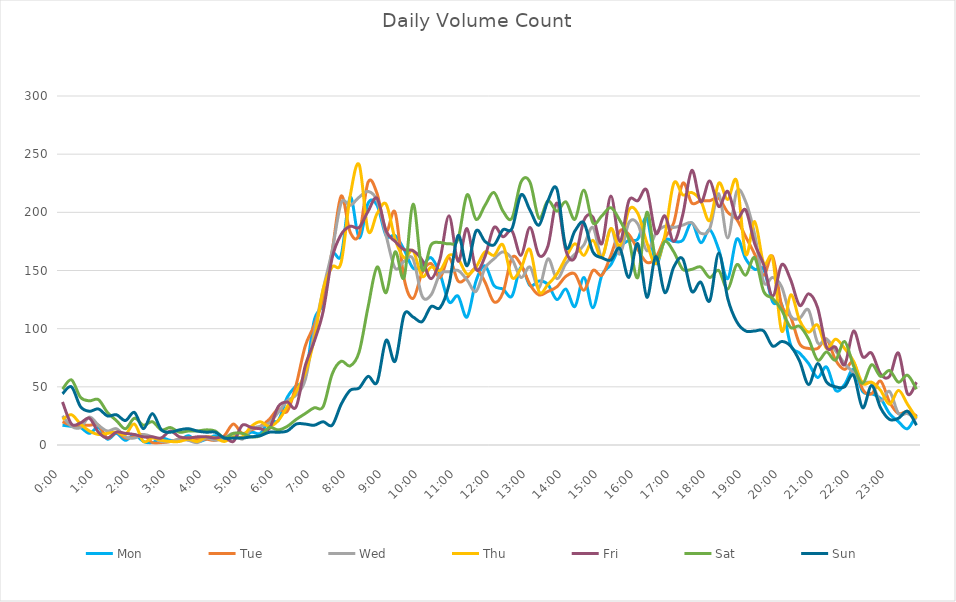
| Category | Mon | Tue | Wed | Thu | Fri | Sat | Sun |
|---|---|---|---|---|---|---|---|
| 0.0 | 17 | 20 | 25 | 22 | 37 | 48 | 44 |
| 0.010416666666666666 | 16 | 17 | 16 | 26 | 18 | 56 | 50 |
| 0.020833333333333332 | 15 | 17 | 15 | 18 | 19 | 41 | 33 |
| 0.03125 | 10 | 17 | 24 | 12 | 23 | 38 | 29 |
| 0.041666666666666664 | 15 | 17 | 17 | 9 | 11 | 39 | 31 |
| 0.05208333333333333 | 5 | 6 | 12 | 10 | 6 | 28 | 25 |
| 0.06249999999999999 | 10 | 11 | 14 | 11 | 11 | 21 | 26 |
| 0.07291666666666666 | 4 | 6 | 7 | 9 | 10 | 14 | 21 |
| 0.08333333333333333 | 9 | 7 | 6 | 18 | 9 | 23 | 28 |
| 0.09375 | 3 | 9 | 9 | 3 | 7 | 17 | 14 |
| 0.10416666666666667 | 2 | 2 | 7 | 6 | 7 | 20 | 27 |
| 0.11458333333333334 | 6 | 2 | 3 | 4 | 6 | 13 | 13 |
| 0.125 | 4 | 3 | 3 | 3 | 12 | 15 | 11 |
| 0.13541666666666666 | 4 | 5 | 5 | 3 | 7 | 11 | 13 |
| 0.14583333333333331 | 8 | 6 | 4 | 5 | 6 | 12 | 14 |
| 0.15624999999999997 | 3 | 5 | 2 | 3 | 7 | 12 | 12 |
| 0.16666666666666663 | 5 | 5 | 6 | 7 | 7 | 13 | 11 |
| 0.1770833333333333 | 8 | 4 | 4 | 6 | 6 | 12 | 11 |
| 0.18749999999999994 | 5 | 8 | 6 | 3 | 7 | 6 | 6 |
| 0.1979166666666666 | 7 | 18 | 10 | 7 | 3 | 10 | 6 |
| 0.20833333333333326 | 6 | 10 | 5 | 7 | 17 | 10 | 6 |
| 0.21874999999999992 | 11 | 13 | 14 | 16 | 15 | 7 | 7 |
| 0.22916666666666657 | 10 | 16 | 16 | 20 | 14 | 8 | 8 |
| 0.23958333333333323 | 21 | 22 | 19 | 16 | 14 | 15 | 11 |
| 0.2499999999999999 | 21 | 31 | 28 | 21 | 33 | 13 | 11 |
| 0.2604166666666666 | 41 | 29 | 38 | 33 | 37 | 16 | 12 |
| 0.27083333333333326 | 51 | 52 | 43 | 46 | 33 | 22 | 18 |
| 0.28124999999999994 | 58 | 85 | 56 | 62 | 68 | 27 | 18 |
| 0.29166666666666663 | 107 | 103 | 97 | 91 | 89 | 32 | 17 |
| 0.3020833333333333 | 122 | 127 | 134 | 134 | 115 | 33 | 20 |
| 0.3125 | 163 | 167 | 167 | 153 | 161 | 61 | 17 |
| 0.3229166666666667 | 163 | 214 | 208 | 157 | 181 | 72 | 35 |
| 0.33333333333333337 | 213 | 183 | 206 | 214 | 188 | 68 | 47 |
| 0.34375000000000006 | 178 | 181 | 213 | 241 | 187 | 80 | 49 |
| 0.35416666666666674 | 208 | 226 | 218 | 184 | 201 | 119 | 59 |
| 0.3645833333333334 | 206 | 216 | 210 | 199 | 212 | 153 | 54 |
| 0.3750000000000001 | 180 | 184 | 180 | 207 | 184 | 131 | 90 |
| 0.3854166666666668 | 180 | 200 | 152 | 177 | 175 | 166 | 72 |
| 0.3958333333333335 | 168 | 143 | 158 | 161 | 168 | 144 | 112 |
| 0.40625000000000017 | 152 | 126 | 160 | 167 | 167 | 207 | 110 |
| 0.41666666666666685 | 154 | 148 | 128 | 145 | 159 | 151 | 106 |
| 0.4270833333333333 | 161 | 156 | 129 | 153 | 143 | 172 | 119 |
| 0.4375000000000002 | 147 | 144 | 147 | 150 | 160 | 174 | 118 |
| 0.4479166666666669 | 123 | 161 | 149 | 163 | 197 | 173 | 138 |
| 0.4583333333333333 | 128 | 141 | 150 | 160 | 158 | 177 | 180 |
| 0.4687500000000003 | 110 | 144 | 142 | 147 | 186 | 215 | 154 |
| 0.47916666666666696 | 141 | 152 | 132 | 153 | 151 | 194 | 184 |
| 0.4895833333333333 | 154 | 140 | 152 | 166 | 162 | 206 | 175 |
| 0.5000000000000003 | 137 | 123 | 160 | 163 | 187 | 217 | 172 |
| 0.510416666666667 | 134 | 131 | 166 | 172 | 179 | 201 | 185 |
| 0.5208333333333334 | 128 | 161 | 160 | 144 | 184 | 195 | 186 |
| 0.5312500000000002 | 153 | 155 | 144 | 152 | 163 | 226 | 215 |
| 0.5416666666666669 | 137 | 138 | 153 | 168 | 187 | 226 | 202 |
| 0.5520833333333335 | 141 | 129 | 135 | 132 | 163 | 195 | 189 |
| 0.5625000000000001 | 138 | 132 | 160 | 138 | 171 | 210 | 210 |
| 0.5729166666666667 | 125 | 136 | 143 | 147 | 208 | 201 | 220 |
| 0.5833333333333334 | 134 | 145 | 156 | 161 | 167 | 209 | 170 |
| 0.59375 | 119 | 147 | 164 | 173 | 161 | 194 | 184 |
| 0.6041666666666666 | 144 | 133 | 172 | 163 | 193 | 219 | 191 |
| 0.6145833333333333 | 118 | 150 | 187 | 176 | 196 | 191 | 166 |
| 0.6249999999999999 | 146 | 146 | 162 | 161 | 173 | 197 | 161 |
| 0.6354166666666665 | 155 | 163 | 186 | 186 | 214 | 204 | 159 |
| 0.6458333333333331 | 170 | 184 | 164 | 171 | 175 | 193 | 169 |
| 0.6562499999999998 | 176 | 181 | 191 | 202 | 210 | 177 | 144 |
| 0.6666666666666666 | 177 | 168 | 190 | 199 | 210 | 144 | 173 |
| 0.677083333333333 | 195 | 157 | 167 | 174 | 219 | 200 | 127 |
| 0.6874999999999997 | 156 | 161 | 182 | 156 | 182 | 160 | 162 |
| 0.6979166666666666 | 176 | 178 | 188 | 180 | 197 | 175 | 131 |
| 0.7083333333333329 | 175 | 191 | 187 | 225 | 175 | 166 | 153 |
| 0.7187499999999996 | 176 | 225 | 189 | 215 | 198 | 151 | 160 |
| 0.7291666666666666 | 191 | 208 | 191 | 217 | 236 | 151 | 132 |
| 0.7395833333333328 | 174 | 210 | 182 | 210 | 209 | 153 | 140 |
| 0.75 | 185 | 210 | 186 | 193 | 227 | 144 | 124 |
| 0.7604166666666666 | 168 | 212 | 216 | 225 | 205 | 150 | 165 |
| 0.7708333333333327 | 143 | 200 | 178 | 211 | 218 | 134 | 126 |
| 0.78125 | 177 | 194 | 218 | 227 | 195 | 155 | 106 |
| 0.7916666666666666 | 160 | 179 | 209 | 164 | 202 | 146 | 98 |
| 0.8020833333333326 | 151 | 164 | 181 | 192 | 173 | 161 | 98 |
| 0.8125 | 151 | 146 | 140 | 156 | 155 | 132 | 98 |
| 0.8229166666666666 | 123 | 162 | 144 | 160 | 128 | 126 | 85 |
| 0.8333333333333334 | 121 | 120 | 136 | 98 | 155 | 116 | 89 |
| 0.84375 | 86 | 110 | 111 | 129 | 142 | 101 | 85 |
| 0.8541666666666666 | 79 | 87 | 109 | 107 | 120 | 102 | 72 |
| 0.8645833333333334 | 70 | 83 | 116 | 97 | 130 | 91 | 52 |
| 0.875 | 58 | 83 | 88 | 103 | 118 | 73 | 70 |
| 0.8854166666666666 | 67 | 91 | 91 | 83 | 84 | 80 | 54 |
| 0.8958333333333334 | 47 | 73 | 81 | 91 | 84 | 73 | 50 |
| 0.90625 | 52 | 65 | 70 | 83 | 69 | 89 | 50 |
| 0.9166666666666666 | 65 | 71 | 62 | 72 | 98 | 68 | 60 |
| 0.9270833333333334 | 46 | 48 | 54 | 53 | 76 | 53 | 32 |
| 0.9375 | 44 | 44 | 53 | 54 | 79 | 69 | 51 |
| 0.9479166666666666 | 40 | 55 | 38 | 47 | 61 | 59 | 32 |
| 0.9583333333333334 | 27 | 37 | 46 | 35 | 59 | 64 | 22 |
| 0.96875 | 20 | 27 | 27 | 47 | 79 | 54 | 23 |
| 0.9791666666666666 | 14 | 29 | 27 | 35 | 44 | 60 | 29 |
| 0.9895833333333334 | 26 | 25 | 22 | 23 | 54 | 48 | 17 |